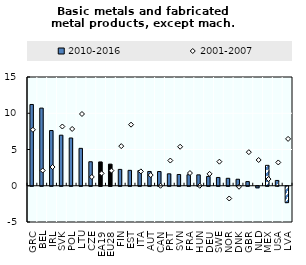
| Category | 2010-2016 |
|---|---|
| GRC | 11.21 |
| BEL | 10.71 |
| IRL | 7.617 |
| SVK | 6.974 |
| POL | 6.587 |
| LTU | 5.158 |
| CZE | 3.31 |
| EA19 | 3.285 |
| EU28 | 2.982 |
| FIN | 2.254 |
| EST | 2.125 |
| ITA | 2.092 |
| AUT | 1.969 |
| CAN | 1.962 |
| PRT | 1.645 |
| SVN | 1.552 |
| FRA | 1.517 |
| HUN | 1.503 |
| DEU | 1.287 |
| SWE | 1.144 |
| NOR | 1.028 |
| DNK | 0.898 |
| GBR | 0.574 |
| NLD | -0.217 |
| MEX | 2.814 |
| USA | 0.733 |
| LVA | -2.264 |